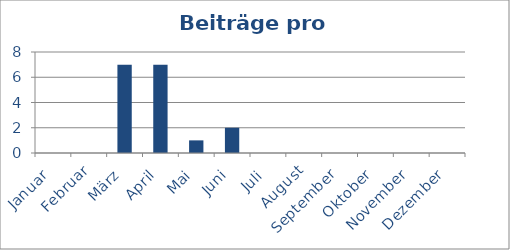
| Category | Beiträge |
|---|---|
| Januar | 0 |
| Februar | 0 |
| März | 7 |
| April | 7 |
| Mai | 1 |
| Juni | 2 |
| Juli | 0 |
| August | 0 |
| September | 0 |
| Oktober | 0 |
| November | 0 |
| Dezember | 0 |